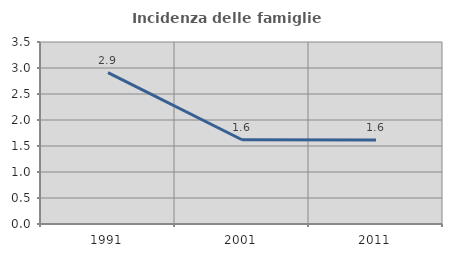
| Category | Incidenza delle famiglie numerose |
|---|---|
| 1991.0 | 2.913 |
| 2001.0 | 1.621 |
| 2011.0 | 1.617 |